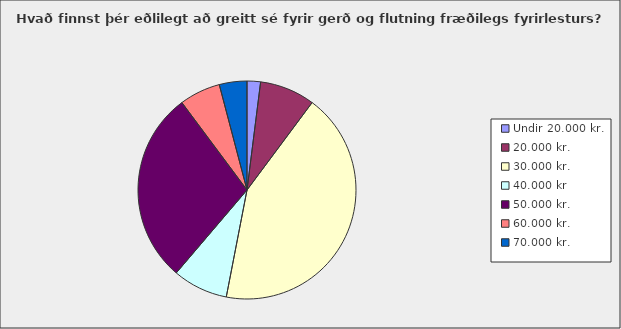
| Category | Series 0 |
|---|---|
| Undir 20.000 kr. | 0.02 |
| 20.000 kr. | 0.082 |
| 30.000 kr. | 0.429 |
| 40.000 kr | 0.082 |
| 50.000 kr. | 0.286 |
| 60.000 kr. | 0.061 |
| 70.000 kr. | 0.041 |